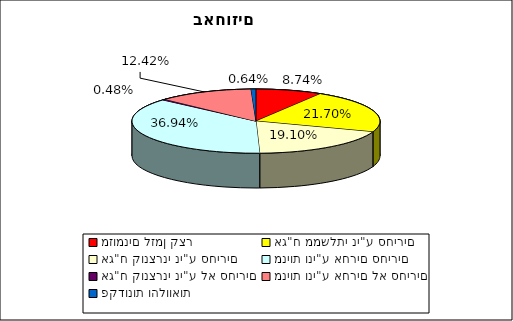
| Category | Series 0 |
|---|---|
| מזומנים לזמן קצר | 0.087 |
| אג"ח ממשלתי ני"ע סחירים | 0.217 |
| אג"ח קונצרני ני"ע סחירים | 0.191 |
| מניות וני"ע אחרים סחירים | 0.369 |
| אג"ח קונצרני ני"ע לא סחירים | 0.005 |
| מניות וני"ע אחרים לא סחירים | 0.124 |
| פקדונות והלוואות | 0.006 |